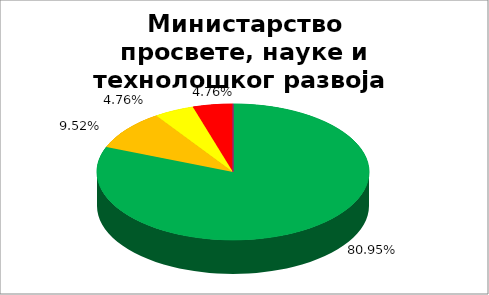
| Category | Министарство просвете, науке и технолошког развоја  |
|---|---|
| 0 | 0.81 |
| 1 | 0.095 |
| 2 | 0.048 |
| 3 | 0.048 |
| 4 | 0 |